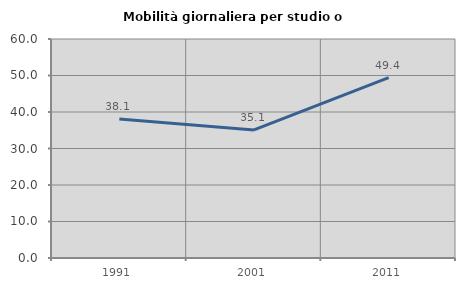
| Category | Mobilità giornaliera per studio o lavoro |
|---|---|
| 1991.0 | 38.114 |
| 2001.0 | 35.078 |
| 2011.0 | 49.392 |